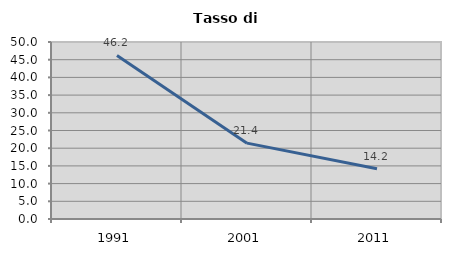
| Category | Tasso di disoccupazione   |
|---|---|
| 1991.0 | 46.199 |
| 2001.0 | 21.429 |
| 2011.0 | 14.17 |